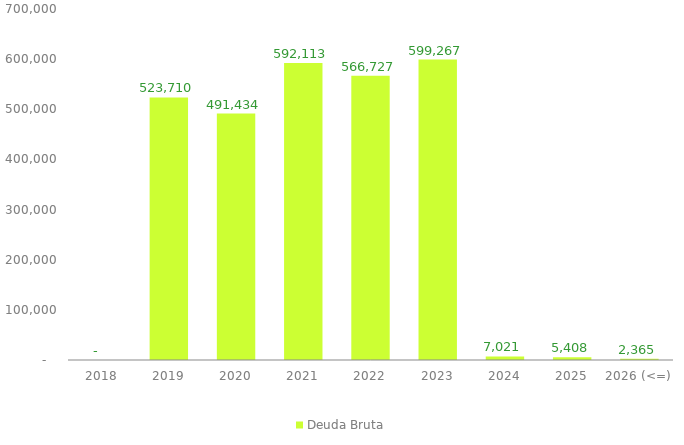
| Category | Deuda Bruta |
|---|---|
| 2018 | 0 |
| 2019 | 523709.941 |
| 2020 | 491434.393 |
| 2021 | 592113.4 |
| 2022 | 566726.592 |
| 2023 | 599267.127 |
| 2024 | 7021.369 |
| 2025 | 5407.91 |
| 2026 (<=) | 2364.721 |